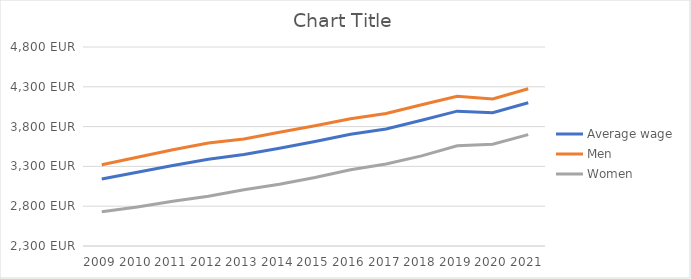
| Category | Average wage | Men | Women |
|---|---|---|---|
| 2009.0 | 3141 | 3320 | 2729 |
| 2010.0 | 3227 | 3416 | 2791 |
| 2011.0 | 3311 | 3508 | 2861 |
| 2012.0 | 3391 | 3595 | 2925 |
| 2013.0 | 3449 | 3645 | 3007 |
| 2014.0 | 3527 | 3728 | 3075 |
| 2015.0 | 3612 | 3810 | 3161 |
| 2016.0 | 3703 | 3898 | 3258 |
| 2017.0 | 3771 | 3964 | 3330 |
| 2018.0 | 3880 | 4075 | 3432 |
| 2019.0 | 3994 | 4181 | 3559 |
| 2020.0 | 3975 | 4146 | 3578 |
| 2021.0 | 4100 | 4275 | 3699 |